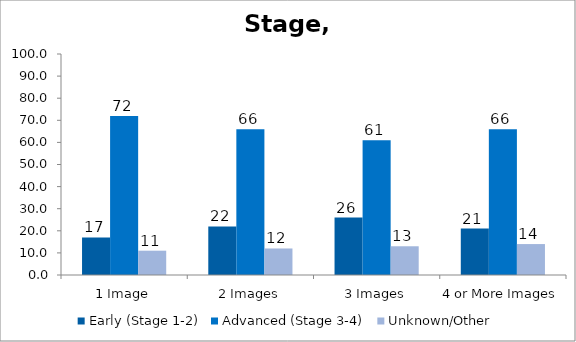
| Category | Early (Stage 1-2) | Advanced (Stage 3-4) | Unknown/Other |
|---|---|---|---|
| 1 Image | 17 | 72 | 11 |
| 2 Images | 22 | 66 | 12 |
| 3 Images | 26 | 61 | 13 |
| 4 or More Images | 21 | 66 | 14 |